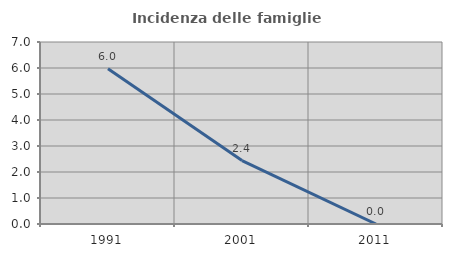
| Category | Incidenza delle famiglie numerose |
|---|---|
| 1991.0 | 5.97 |
| 2001.0 | 2.439 |
| 2011.0 | 0 |